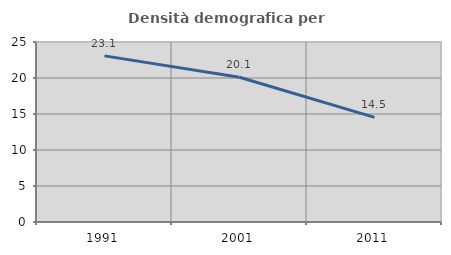
| Category | Densità demografica |
|---|---|
| 1991.0 | 23.071 |
| 2001.0 | 20.107 |
| 2011.0 | 14.528 |